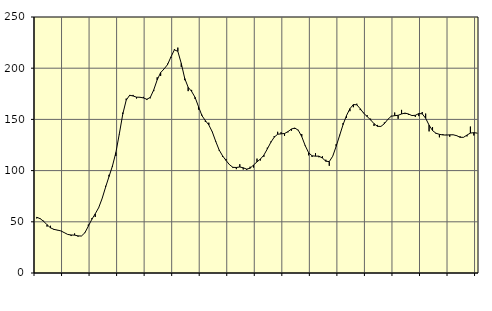
| Category | Piggar | Series 1 |
|---|---|---|
| nan | 53.3 | 54.45 |
| 87.0 | 53.4 | 53.05 |
| 87.0 | 51 | 50.53 |
| 87.0 | 45.3 | 47.12 |
| nan | 46.1 | 44.13 |
| 88.0 | 42.1 | 42.6 |
| 88.0 | 41.7 | 41.92 |
| 88.0 | 41.2 | 41.13 |
| nan | 39.3 | 39.44 |
| 89.0 | 37.7 | 37.67 |
| 89.0 | 36.1 | 37.12 |
| 89.0 | 38.6 | 36.99 |
| nan | 35.5 | 36.23 |
| 90.0 | 36.2 | 36.11 |
| 90.0 | 39 | 39.35 |
| 90.0 | 47.3 | 45.77 |
| nan | 53.4 | 52.36 |
| 91.0 | 54.7 | 57.78 |
| 91.0 | 64 | 63.8 |
| 91.0 | 72.6 | 72.7 |
| nan | 85.1 | 83.72 |
| 92.0 | 95.9 | 94.19 |
| 92.0 | 103.7 | 104.45 |
| 92.0 | 114.3 | 117.66 |
| nan | 135.5 | 135.84 |
| 93.0 | 156.6 | 155.16 |
| 93.0 | 170.3 | 168.78 |
| 93.0 | 172.8 | 173.6 |
| nan | 173.9 | 172.88 |
| 94.0 | 170.4 | 171.72 |
| 94.0 | 171.8 | 171.63 |
| 94.0 | 172 | 170.96 |
| nan | 168.9 | 169.65 |
| 95.0 | 170.6 | 171.5 |
| 95.0 | 177.6 | 178.84 |
| 95.0 | 191.1 | 188.59 |
| nan | 192.5 | 195.68 |
| 96.0 | 199.5 | 199.27 |
| 96.0 | 204.4 | 203.44 |
| 96.0 | 210.2 | 211.03 |
| nan | 218.7 | 217.95 |
| 97.0 | 220.1 | 216.45 |
| 97.0 | 201.3 | 204.65 |
| 97.0 | 188.3 | 190.02 |
| nan | 177.6 | 181.33 |
| 98.0 | 178.8 | 177.35 |
| 98.0 | 170 | 171.59 |
| 98.0 | 159.6 | 162.53 |
| nan | 154.5 | 153.69 |
| 99.0 | 147.5 | 148.84 |
| 99.0 | 146.8 | 144.59 |
| 99.0 | 137.7 | 137.88 |
| nan | 128.1 | 128.64 |
| 0.0 | 119.6 | 120.19 |
| 0.0 | 113.4 | 114.37 |
| 0.0 | 111.4 | 109.91 |
| nan | 106.1 | 105.8 |
| 1.0 | 102.5 | 103.19 |
| 1.0 | 101.4 | 103.05 |
| 1.0 | 106.2 | 103.52 |
| nan | 101.1 | 102.75 |
| 2.0 | 100.6 | 101.44 |
| 2.0 | 103.8 | 102.33 |
| 2.0 | 103 | 105.45 |
| nan | 111.7 | 108.55 |
| 3.0 | 109.9 | 111.31 |
| 3.0 | 113.5 | 115.17 |
| 3.0 | 122.4 | 121.11 |
| nan | 128.3 | 127.52 |
| 4.0 | 133.7 | 132.64 |
| 4.0 | 137.9 | 135.49 |
| 4.0 | 137.5 | 135.91 |
| nan | 133.9 | 136.22 |
| 5.0 | 137.4 | 138.07 |
| 5.0 | 138.9 | 140.62 |
| 5.0 | 140.6 | 141.57 |
| nan | 139.8 | 139.36 |
| 6.0 | 135.7 | 133.23 |
| 6.0 | 124 | 124.45 |
| 6.0 | 114.9 | 117.42 |
| nan | 113.3 | 114.46 |
| 7.0 | 117 | 114.09 |
| 7.0 | 113 | 114.11 |
| 7.0 | 114 | 112.25 |
| nan | 110.6 | 109.16 |
| 8.0 | 104.7 | 108.81 |
| 8.0 | 114 | 114.03 |
| 8.0 | 125.9 | 123.69 |
| nan | 134.9 | 134.22 |
| 9.0 | 146.4 | 144.85 |
| 9.0 | 151.5 | 153.73 |
| 9.0 | 158 | 160.5 |
| nan | 161.9 | 164.48 |
| 10.0 | 165.3 | 164.25 |
| 10.0 | 159.1 | 160.36 |
| 10.0 | 156.5 | 156 |
| nan | 154.2 | 152.8 |
| 11.0 | 150.7 | 149.54 |
| 11.0 | 143.6 | 145.83 |
| 11.0 | 144.6 | 143.22 |
| nan | 143.2 | 143.13 |
| 12.0 | 147 | 145.78 |
| 12.0 | 150.3 | 150 |
| 12.0 | 153.5 | 153.08 |
| nan | 156.7 | 153.65 |
| 13.0 | 150.6 | 153.98 |
| 13.0 | 159.3 | 155.31 |
| 13.0 | 155.2 | 156.17 |
| nan | 154.5 | 155.29 |
| 14.0 | 153.5 | 153.77 |
| 14.0 | 152.4 | 153.98 |
| 14.0 | 153.2 | 155.72 |
| nan | 157.2 | 155.47 |
| 15.0 | 155.7 | 151.11 |
| 15.0 | 138.3 | 144.4 |
| 15.0 | 142.5 | 139.08 |
| nan | 136 | 136.49 |
| 16.0 | 132.5 | 135.42 |
| 16.0 | 135.7 | 134.82 |
| 16.0 | 135 | 134.69 |
| nan | 133.1 | 134.92 |
| 17.0 | 135.1 | 134.97 |
| 17.0 | 134.5 | 134.11 |
| 17.0 | 133.5 | 132.52 |
| nan | 132.6 | 132.5 |
| 18.0 | 133.4 | 134.68 |
| 18.0 | 143 | 136.63 |
| 18.0 | 134.3 | 137.04 |
| nan | 136.5 | 136.62 |